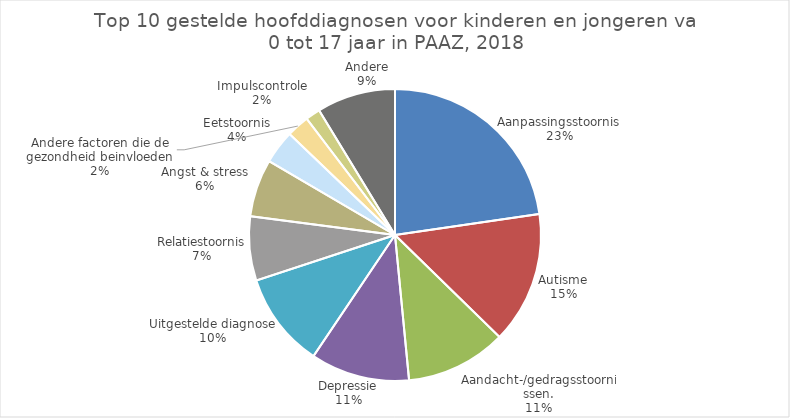
| Category | Series 0 |
|---|---|
| Aanpassingsstoornis | 751 |
| Autisme | 483 |
| Aandacht-/gedragsstoornissen. | 369 |
| Depressie | 363 |
| Uitgestelde diagnose | 348 |
| Relatiestoornis | 235 |
| Angst & stress | 211 |
| Eetstoornis | 123 |
| Andere factoren die de gezondheid beinvloeden | 83 |
| Impulscontrole | 54 |
| Andere | 288 |